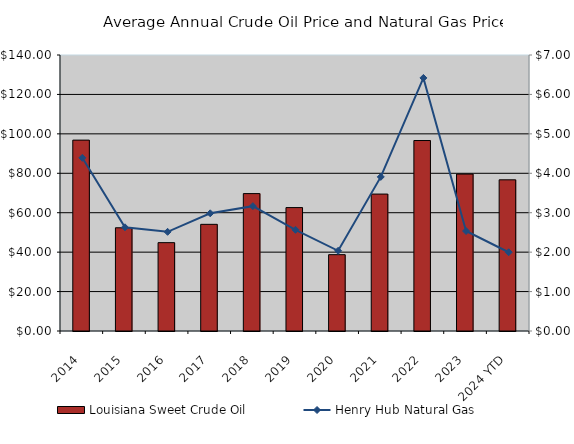
| Category | Louisiana Sweet Crude Oil |
|---|---|
| 2014 | 96.825 |
| 2015 | 52.363 |
| 2016 | 44.813 |
| 2017 | 54.102 |
| 2018 | 69.693 |
| 2019 | 62.599 |
| 2020 | 38.719 |
| 2021 | 69.461 |
| 2022 | 96.617 |
| 2023 | 79.603 |
| 2024 YTD | 76.685 |